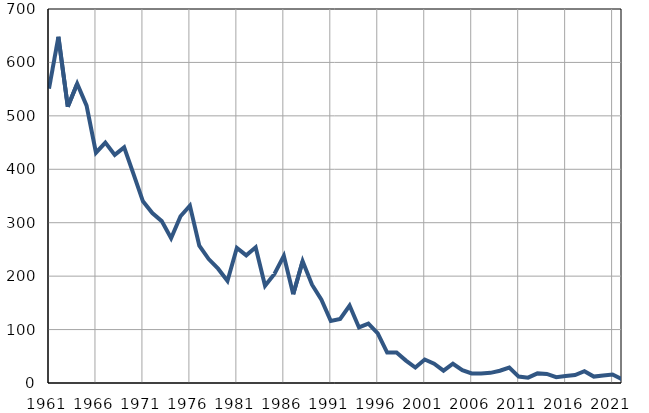
| Category | Умрла 
одојчад |
|---|---|
| 1961.0 | 551 |
| 1962.0 | 648 |
| 1963.0 | 517 |
| 1964.0 | 560 |
| 1965.0 | 519 |
| 1966.0 | 431 |
| 1967.0 | 450 |
| 1968.0 | 427 |
| 1969.0 | 441 |
| 1970.0 | 391 |
| 1971.0 | 340 |
| 1972.0 | 318 |
| 1973.0 | 303 |
| 1974.0 | 271 |
| 1975.0 | 312 |
| 1976.0 | 332 |
| 1977.0 | 257 |
| 1978.0 | 232 |
| 1979.0 | 214 |
| 1980.0 | 191 |
| 1981.0 | 253 |
| 1982.0 | 239 |
| 1983.0 | 254 |
| 1984.0 | 182 |
| 1985.0 | 204 |
| 1986.0 | 238 |
| 1987.0 | 166 |
| 1988.0 | 228 |
| 1989.0 | 184 |
| 1990.0 | 156 |
| 1991.0 | 116 |
| 1992.0 | 120 |
| 1993.0 | 145 |
| 1994.0 | 104 |
| 1995.0 | 111 |
| 1996.0 | 93 |
| 1997.0 | 57 |
| 1998.0 | 57 |
| 1999.0 | 42 |
| 2000.0 | 29 |
| 2001.0 | 44 |
| 2002.0 | 36 |
| 2003.0 | 23 |
| 2004.0 | 36 |
| 2005.0 | 24 |
| 2006.0 | 18 |
| 2007.0 | 18 |
| 2008.0 | 19 |
| 2009.0 | 23 |
| 2010.0 | 29 |
| 2011.0 | 12 |
| 2012.0 | 10 |
| 2013.0 | 18 |
| 2014.0 | 17 |
| 2015.0 | 11 |
| 2016.0 | 13 |
| 2017.0 | 15 |
| 2018.0 | 22 |
| 2019.0 | 12 |
| 2020.0 | 14 |
| 2021.0 | 16 |
| 2022.0 | 7 |